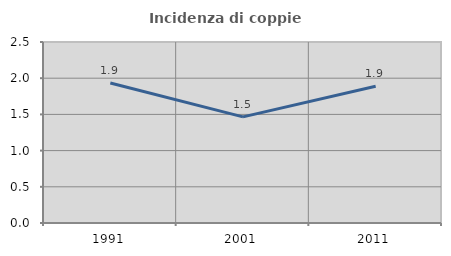
| Category | Incidenza di coppie miste |
|---|---|
| 1991.0 | 1.933 |
| 2001.0 | 1.466 |
| 2011.0 | 1.888 |